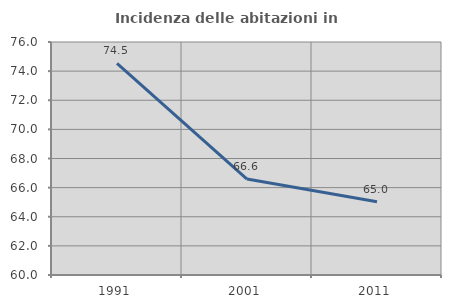
| Category | Incidenza delle abitazioni in proprietà  |
|---|---|
| 1991.0 | 74.535 |
| 2001.0 | 66.589 |
| 2011.0 | 65.034 |